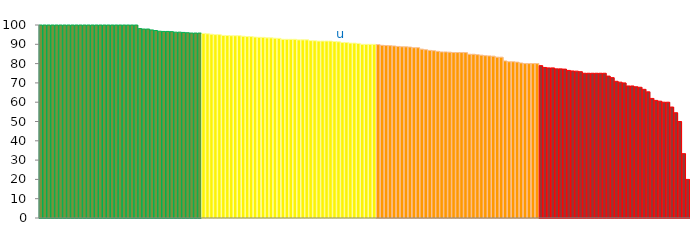
| Category | Top Quartile | 2nd Quartile | 3rd Quartile | Bottom Quartile | Series 4 |
|---|---|---|---|---|---|
|  | 100 | 0 | 0 | 0 | 100 |
|  | 100 | 0 | 0 | 0 | 100 |
|  | 100 | 0 | 0 | 0 | 100 |
|  | 100 | 0 | 0 | 0 | 100 |
|  | 100 | 0 | 0 | 0 | 100 |
|  | 100 | 0 | 0 | 0 | 100 |
|  | 100 | 0 | 0 | 0 | 100 |
|  | 100 | 0 | 0 | 0 | 100 |
|  | 100 | 0 | 0 | 0 | 100 |
|  | 100 | 0 | 0 | 0 | 100 |
|  | 100 | 0 | 0 | 0 | 100 |
|  | 100 | 0 | 0 | 0 | 100 |
|  | 100 | 0 | 0 | 0 | 100 |
|  | 100 | 0 | 0 | 0 | 100 |
|  | 100 | 0 | 0 | 0 | 100 |
|  | 100 | 0 | 0 | 0 | 100 |
|  | 100 | 0 | 0 | 0 | 100 |
|  | 100 | 0 | 0 | 0 | 100 |
|  | 100 | 0 | 0 | 0 | 100 |
|  | 100 | 0 | 0 | 0 | 100 |
|  | 100 | 0 | 0 | 0 | 100 |
|  | 100 | 0 | 0 | 0 | 100 |
|  | 100 | 0 | 0 | 0 | 100 |
|  | 100 | 0 | 0 | 0 | 100 |
|  | 100 | 0 | 0 | 0 | 100 |
|  | 98.148 | 0 | 0 | 0 | 98.148 |
|  | 97.917 | 0 | 0 | 0 | 97.917 |
|  | 97.917 | 0 | 0 | 0 | 97.917 |
|  | 97.436 | 0 | 0 | 0 | 97.436 |
|  | 97.143 | 0 | 0 | 0 | 97.143 |
|  | 96.774 | 0 | 0 | 0 | 96.774 |
|  | 96.667 | 0 | 0 | 0 | 96.667 |
|  | 96.667 | 0 | 0 | 0 | 96.667 |
|  | 96.552 | 0 | 0 | 0 | 96.552 |
|  | 96.296 | 0 | 0 | 0 | 96.296 |
|  | 96.296 | 0 | 0 | 0 | 96.296 |
|  | 96.154 | 0 | 0 | 0 | 96.154 |
|  | 96 | 0 | 0 | 0 | 96 |
|  | 95.833 | 0 | 0 | 0 | 95.833 |
|  | 95.833 | 0 | 0 | 0 | 95.833 |
|  | 95.833 | 0 | 0 | 0 | 95.833 |
|  | 0 | 95.652 | 0 | 0 | 95.652 |
|  | 0 | 95.455 | 0 | 0 | 95.455 |
|  | 0 | 95.238 | 0 | 0 | 95.238 |
|  | 0 | 95 | 0 | 0 | 95 |
|  | 0 | 95 | 0 | 0 | 95 |
|  | 0 | 94.595 | 0 | 0 | 94.595 |
|  | 0 | 94.545 | 0 | 0 | 94.545 |
|  | 0 | 94.444 | 0 | 0 | 94.444 |
|  | 0 | 94.444 | 0 | 0 | 94.444 |
|  | 0 | 94.444 | 0 | 0 | 94.444 |
|  | 0 | 94.203 | 0 | 0 | 94.203 |
|  | 0 | 94 | 0 | 0 | 94 |
|  | 0 | 94 | 0 | 0 | 94 |
|  | 0 | 93.75 | 0 | 0 | 93.75 |
|  | 0 | 93.651 | 0 | 0 | 93.651 |
|  | 0 | 93.617 | 0 | 0 | 93.617 |
|  | 0 | 93.333 | 0 | 0 | 93.333 |
|  | 0 | 93.333 | 0 | 0 | 93.333 |
|  | 0 | 93.182 | 0 | 0 | 93.182 |
|  | 0 | 93.103 | 0 | 0 | 93.103 |
|  | 0 | 92.593 | 0 | 0 | 92.593 |
|  | 0 | 92.593 | 0 | 0 | 92.593 |
|  | 0 | 92.593 | 0 | 0 | 92.593 |
|  | 0 | 92.593 | 0 | 0 | 92.593 |
|  | 0 | 92.308 | 0 | 0 | 92.308 |
|  | 0 | 92.308 | 0 | 0 | 92.308 |
|  | 0 | 92.308 | 0 | 0 | 92.308 |
|  | 0 | 91.892 | 0 | 0 | 91.892 |
|  | 0 | 91.837 | 0 | 0 | 91.837 |
|  | 0 | 91.667 | 0 | 0 | 91.667 |
|  | 0 | 91.667 | 0 | 0 | 91.667 |
|  | 0 | 91.667 | 0 | 0 | 91.667 |
|  | 0 | 91.667 | 0 | 0 | 91.667 |
|  | 0 | 91.429 | 0 | 0 | 91.429 |
|  | 0 | 91.304 | 0 | 0 | 91.304 |
| u | 0 | 90.909 | 0 | 0 | 90.909 |